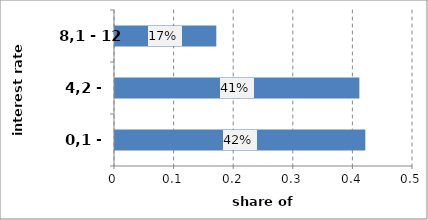
| Category | Series 0 |
|---|---|
| 0,1 - 4,1 | 0.42 |
| 4,2 - 8,0 | 0.41 |
| 8,1 - 12 | 0.17 |